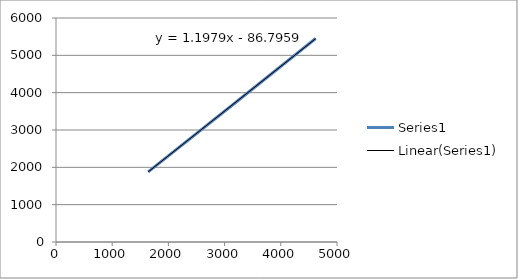
| Category | Series 0 |
|---|---|
| 1640.0 | 1880 |
| 3190.0 | 3730 |
| 4620.0 | 5450 |